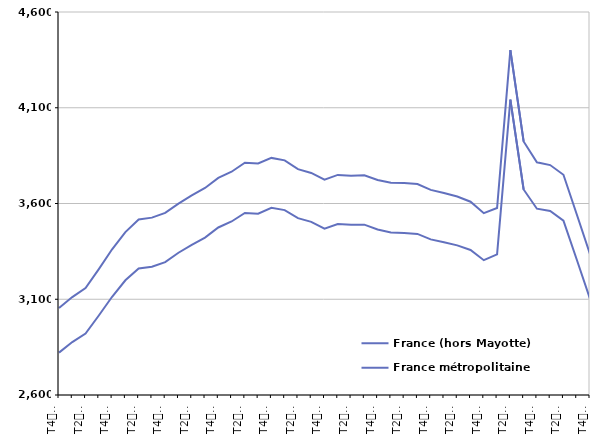
| Category | France (hors Mayotte) | France métropolitaine |
|---|---|---|
| T4
2011 | 3053.8 | 2821.4 |
| T1
2012 | 3111.4 | 2876.4 |
| T2
2012 | 3158.4 | 2920.8 |
| T3
2012 | 3257.4 | 3015.3 |
| T4
2012 | 3360.9 | 3113 |
| T1
2013 | 3450.6 | 3199.2 |
| T2
2013 | 3516.7 | 3260.9 |
| T3
2013 | 3526.2 | 3270.1 |
| T4
2013 | 3550.8 | 3293.8 |
| T1
2014 | 3599.5 | 3343 |
| T2
2014 | 3641.9 | 3383.7 |
| T3
2014 | 3681.3 | 3422.1 |
| T4
2014 | 3734 | 3474.8 |
| T1
2015 | 3766 | 3506.1 |
| T2
2015 | 3812.9 | 3550.5 |
| T3
2015 | 3808.8 | 3546.7 |
| T4
2015 | 3838.1 | 3577.7 |
| T1
2016 | 3825.3 | 3565.5 |
| T2
2016 | 3779.3 | 3523.3 |
| T3
2016 | 3759.7 | 3504 |
| T4
2016 | 3724.6 | 3468.4 |
| T1
2017 | 3749.2 | 3492.3 |
| T2
2017 | 3744.8 | 3488.6 |
| T3
2017 | 3746.9 | 3489.6 |
| T4
2017 | 3723 | 3464 |
| T1
2018 | 3708.6 | 3448.7 |
| T2
2018 | 3706.6 | 3445.4 |
| T3
2018 | 3702 | 3441.1 |
| T4
2018 | 3671.2 | 3412.7 |
| T1
2019 | 3654.9 | 3397.5 |
| T2
2019 | 3636.3 | 3381.2 |
| T3
2019 | 3609.2 | 3357.3 |
| T4
2019 | 3549.3 | 3303.9 |
| T1
2020 | 3576.6 | 3334.2 |
| T2
2020 | 4400.8 | 4142.7 |
| T3
2020 | 3923.9 | 3673.2 |
| T4
2020 | 3815.2 | 3572.8 |
| T1
2021 | 3800.7 | 3560.6 |
| T2
2021 | 3750.1 | 3510.5 |
| T3
2021 | 3544.1 | 3307.4 |
| T4
2021 | 3335.6 | 3101.8 |